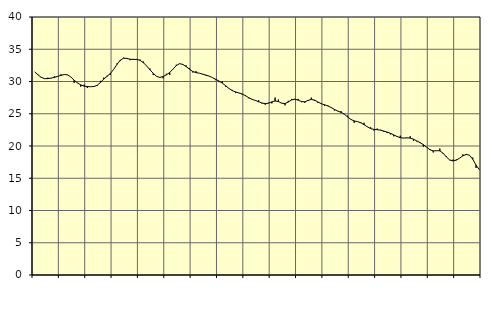
| Category | Piggar | Series 1 |
|---|---|---|
| nan | 31.5 | 31.5 |
| 87.0 | 31 | 31.04 |
| 87.0 | 30.7 | 30.64 |
| 87.0 | 30.4 | 30.44 |
| nan | 30.6 | 30.45 |
| 88.0 | 30.5 | 30.53 |
| 88.0 | 30.8 | 30.64 |
| 88.0 | 30.8 | 30.79 |
| nan | 31.1 | 30.95 |
| 89.0 | 31.1 | 31.08 |
| 89.0 | 31 | 31.03 |
| 89.0 | 30.7 | 30.7 |
| nan | 29.8 | 30.2 |
| 90.0 | 29.8 | 29.77 |
| 90.0 | 29.2 | 29.48 |
| 90.0 | 29.5 | 29.29 |
| nan | 29 | 29.21 |
| 91.0 | 29.2 | 29.19 |
| 91.0 | 29.3 | 29.22 |
| 91.0 | 29.3 | 29.42 |
| nan | 30.1 | 29.86 |
| 92.0 | 30.6 | 30.38 |
| 92.0 | 30.9 | 30.8 |
| 92.0 | 31 | 31.25 |
| nan | 31.9 | 31.88 |
| 93.0 | 32.8 | 32.66 |
| 93.0 | 33.2 | 33.31 |
| 93.0 | 33.7 | 33.61 |
| nan | 33.5 | 33.58 |
| 94.0 | 33.3 | 33.45 |
| 94.0 | 33.5 | 33.42 |
| 94.0 | 33.5 | 33.43 |
| nan | 33.4 | 33.28 |
| 95.0 | 33.1 | 32.92 |
| 95.0 | 32.4 | 32.41 |
| 95.0 | 32 | 31.82 |
| nan | 31 | 31.26 |
| 96.0 | 30.8 | 30.81 |
| 96.0 | 30.6 | 30.63 |
| 96.0 | 30.5 | 30.77 |
| nan | 31.2 | 31.03 |
| 97.0 | 31 | 31.4 |
| 97.0 | 31.9 | 31.92 |
| 97.0 | 32.6 | 32.46 |
| nan | 32.8 | 32.76 |
| 98.0 | 32.6 | 32.65 |
| 98.0 | 32.5 | 32.32 |
| 98.0 | 32.1 | 31.91 |
| nan | 31.4 | 31.55 |
| 99.0 | 31.6 | 31.38 |
| 99.0 | 31.3 | 31.29 |
| 99.0 | 31.1 | 31.15 |
| nan | 30.9 | 30.99 |
| 0.0 | 30.8 | 30.83 |
| 0.0 | 30.6 | 30.6 |
| 0.0 | 30.2 | 30.33 |
| nan | 29.9 | 30.06 |
| 1.0 | 30 | 29.74 |
| 1.0 | 29.2 | 29.34 |
| 1.0 | 28.9 | 28.91 |
| nan | 28.7 | 28.59 |
| 2.0 | 28.2 | 28.38 |
| 2.0 | 28.2 | 28.23 |
| 2.0 | 28 | 28.07 |
| nan | 27.9 | 27.8 |
| 3.0 | 27.4 | 27.49 |
| 3.0 | 27.2 | 27.24 |
| 3.0 | 27.1 | 27.06 |
| nan | 27.1 | 26.86 |
| 4.0 | 26.6 | 26.67 |
| 4.0 | 26.4 | 26.57 |
| 4.0 | 26.7 | 26.64 |
| nan | 26.6 | 26.84 |
| 5.0 | 27.5 | 26.98 |
| 5.0 | 27.2 | 26.89 |
| 5.0 | 26.6 | 26.64 |
| nan | 26.3 | 26.58 |
| 6.0 | 27 | 26.82 |
| 6.0 | 27.3 | 27.15 |
| 6.0 | 27.3 | 27.26 |
| nan | 27.3 | 27.11 |
| 7.0 | 26.8 | 26.88 |
| 7.0 | 26.7 | 26.85 |
| 7.0 | 27 | 27.07 |
| nan | 27.5 | 27.23 |
| 8.0 | 27 | 27.11 |
| 8.0 | 26.7 | 26.82 |
| 8.0 | 26.6 | 26.56 |
| nan | 26.2 | 26.39 |
| 9.0 | 26.3 | 26.22 |
| 9.0 | 26 | 25.96 |
| 9.0 | 25.5 | 25.67 |
| nan | 25.4 | 25.42 |
| 10.0 | 25.4 | 25.22 |
| 10.0 | 24.9 | 24.94 |
| 10.0 | 24.7 | 24.51 |
| nan | 24.1 | 24.12 |
| 11.0 | 23.6 | 23.89 |
| 11.0 | 23.8 | 23.78 |
| 11.0 | 23.7 | 23.6 |
| nan | 23.6 | 23.31 |
| 12.0 | 23 | 22.97 |
| 12.0 | 22.9 | 22.7 |
| 12.0 | 22.4 | 22.57 |
| nan | 22.7 | 22.53 |
| 13.0 | 22.5 | 22.45 |
| 13.0 | 22.2 | 22.32 |
| 13.0 | 22 | 22.16 |
| nan | 21.8 | 21.97 |
| 14.0 | 21.5 | 21.72 |
| 14.0 | 21.5 | 21.48 |
| 14.0 | 21.6 | 21.29 |
| nan | 21.2 | 21.23 |
| 15.0 | 21.3 | 21.26 |
| 15.0 | 21.5 | 21.23 |
| 15.0 | 20.8 | 21.05 |
| nan | 20.7 | 20.79 |
| 16.0 | 20.6 | 20.52 |
| 16.0 | 19.9 | 20.21 |
| 16.0 | 19.8 | 19.81 |
| nan | 19.5 | 19.42 |
| 17.0 | 19 | 19.24 |
| 17.0 | 19.3 | 19.27 |
| 17.0 | 19.6 | 19.25 |
| nan | 18.8 | 18.88 |
| 18.0 | 18.4 | 18.29 |
| 18.0 | 17.8 | 17.84 |
| 18.0 | 17.9 | 17.68 |
| nan | 17.9 | 17.81 |
| 19.0 | 18.1 | 18.12 |
| 19.0 | 18.7 | 18.47 |
| 19.0 | 18.6 | 18.7 |
| nan | 18.6 | 18.57 |
| 20.0 | 18.2 | 17.95 |
| 20.0 | 16.6 | 17.04 |
| 20.0 | 16.3 | 16.33 |